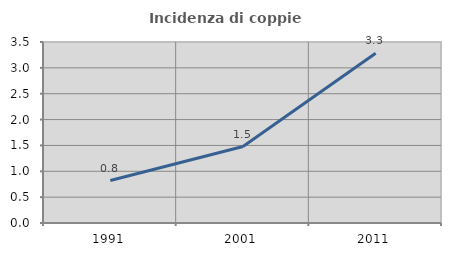
| Category | Incidenza di coppie miste |
|---|---|
| 1991.0 | 0.821 |
| 2001.0 | 1.478 |
| 2011.0 | 3.284 |